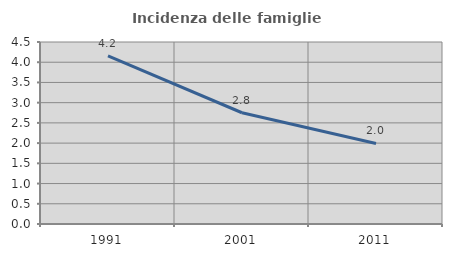
| Category | Incidenza delle famiglie numerose |
|---|---|
| 1991.0 | 4.158 |
| 2001.0 | 2.751 |
| 2011.0 | 1.992 |